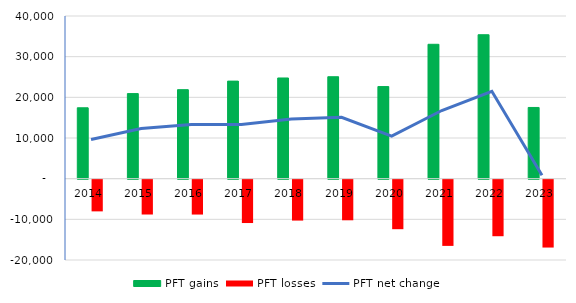
| Category | PFT gains | PFT losses |
|---|---|---|
| 2014.0 | 17432 | -7796 |
| 2015.0 | 20916 | -8568 |
| 2016.0 | 21887 | -8578 |
| 2017.0 | 23986 | -10664 |
| 2018.0 | 24758 | -10061 |
| 2019.0 | 25066 | -9988 |
| 2020.0 | 22645 | -12177 |
| 2021.0 | 33045 | -16286 |
| 2022.0 | 35397 | -13907 |
| 2023.0 | 17511 | -16693 |